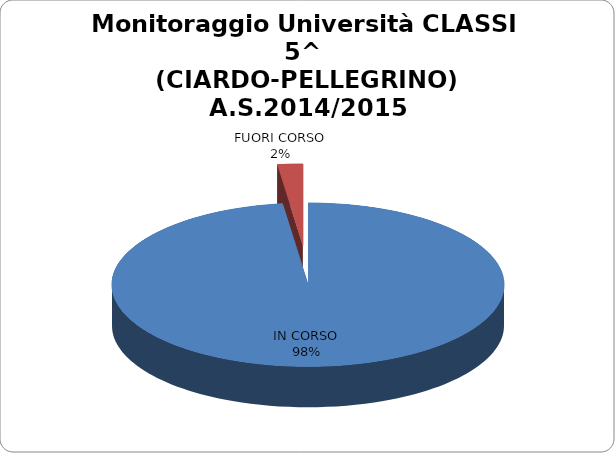
| Category | Series 0 | 97,92% 2,08% |
|---|---|---|
| IN CORSO | 0.979 |  |
| FUORI CORSO | 0.021 |  |